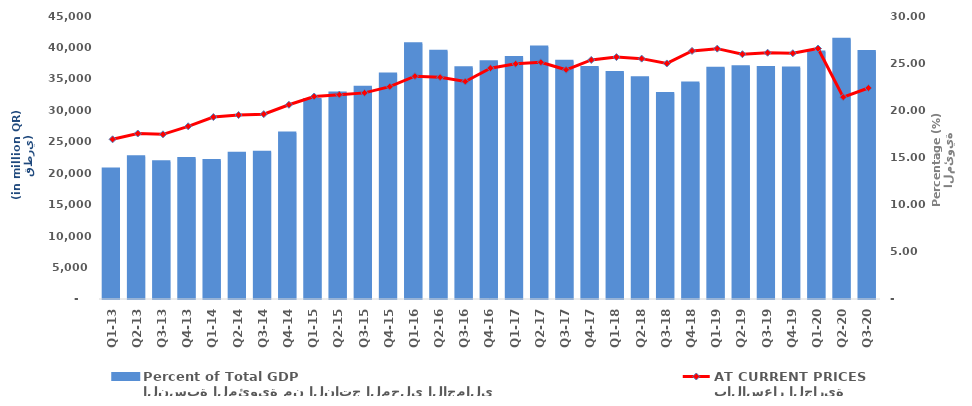
| Category | النسبة المئوية من الناتج المحلي الاجمالي
Percent of Total GDP |
|---|---|
| Q1-13 | 13.77 |
| Q2-13 | 15.071 |
| Q3-13 | 14.545 |
| Q4-13 | 14.896 |
| Q1-14 | 14.693 |
| Q2-14 | 15.448 |
| Q3-14 | 15.568 |
| Q4-14 | 17.589 |
| Q1-15 | 21.142 |
| Q2-15 | 21.828 |
| Q3-15 | 22.456 |
| Q4-15 | 23.84 |
| Q1-16 | 27.071 |
| Q2-16 | 26.254 |
| Q3-16 | 24.511 |
| Q4-16 | 25.137 |
| Q1-17 | 25.614 |
| Q2-17 | 26.704 |
| Q3-17 | 25.206 |
| Q4-17 | 24.545 |
| Q1-18 | 24.016 |
| Q2-18 | 23.454 |
| Q3-18 | 21.787 |
| Q4-18 | 22.893 |
| Q1-19 | 24.467 |
| Q2-19 | 24.615 |
| Q3-19 | 24.545 |
| Q4-19 | 24.476 |
| Q1-20 | 26.174 |
| Q2-20 | 27.534 |
| Q3-20 | 26.248 |